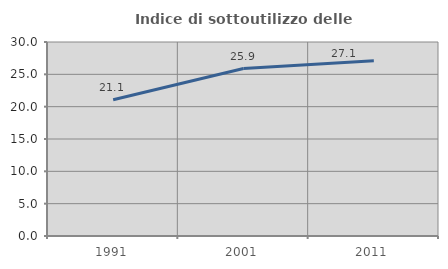
| Category | Indice di sottoutilizzo delle abitazioni  |
|---|---|
| 1991.0 | 21.072 |
| 2001.0 | 25.896 |
| 2011.0 | 27.082 |